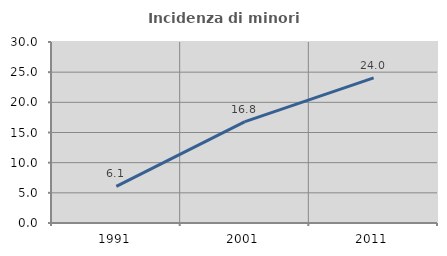
| Category | Incidenza di minori stranieri |
|---|---|
| 1991.0 | 6.061 |
| 2001.0 | 16.807 |
| 2011.0 | 24.044 |